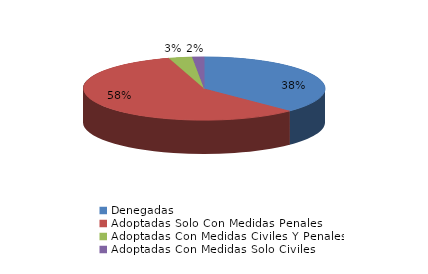
| Category | Series 0 |
|---|---|
| Denegadas | 24 |
| Adoptadas Solo Con Medidas Penales | 37 |
| Adoptadas Con Medidas Civiles Y Penales | 2 |
| Adoptadas Con Medidas Solo Civiles | 1 |